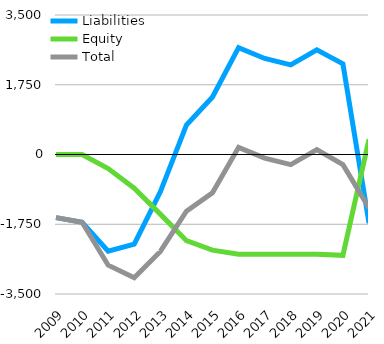
| Category | Liabilities  | Equity  | Total  |
|---|---|---|---|
| 2009 | -1584 | 0 | -1584 |
| 2010 | -1699 | 0 | -1699 |
| 2011 | -2423 | -354 | -2777 |
| 2012 | -2248 | -845 | -3093 |
| 2013 | -937 | -1496 | -2433 |
| 2014 | 740 | -2163 | -1423 |
| 2015 | 1442 | -2400 | -958 |
| 2016 | 2682 | -2502 | 180 |
| 2017 | 2410 | -2502 | -92 |
| 2018 | 2248 | -2502 | -254 |
| 2019 | 2624 | -2502 | 122 |
| 2020 | 2276 | -2530 | -254 |
| 2021 | -1724 | 380.5 | -1343.5 |